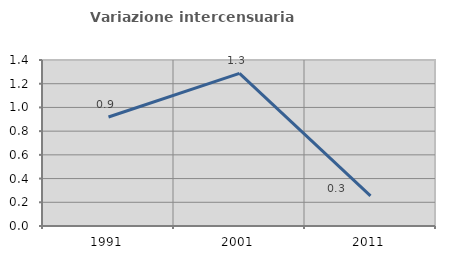
| Category | Variazione intercensuaria annua |
|---|---|
| 1991.0 | 0.919 |
| 2001.0 | 1.287 |
| 2011.0 | 0.253 |